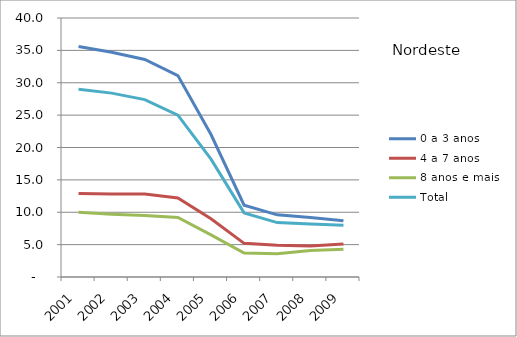
| Category | 0 a 3 anos | 4 a 7 anos | 8 anos e mais | Total |
|---|---|---|---|---|
| 2001.0 | 35.6 | 12.9 | 10 | 29 |
| 2002.0 | 34.7 | 12.8 | 9.7 | 28.4 |
| 2003.0 | 33.6 | 12.8 | 9.5 | 27.4 |
| 2004.0 | 31.1 | 12.2 | 9.2 | 25 |
| 2005.0 | 22 | 9 | 6.5 | 18.2 |
| 2006.0 | 11.1 | 5.2 | 3.7 | 9.9 |
| 2007.0 | 9.6 | 4.9 | 3.6 | 8.4 |
| 2008.0 | 9.2 | 4.8 | 4.1 | 8.2 |
| 2009.0 | 8.7 | 5.1 | 4.3 | 8 |